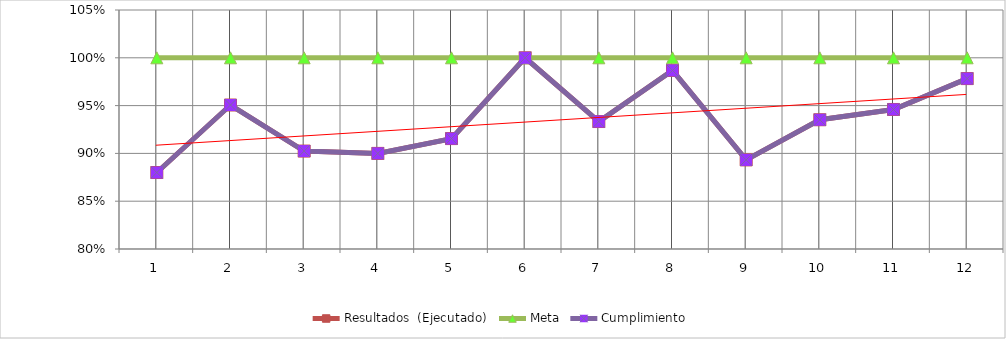
| Category | Resultados  (Ejecutado) | Meta | Cumplimiento |
|---|---|---|---|
| 0 | 0.88 | 1 | 0.88 |
| 1 | 0.951 | 1 | 0.951 |
| 2 | 0.902 | 1 | 0.902 |
| 3 | 0.9 | 1 | 0.9 |
| 4 | 0.915 | 1 | 0.915 |
| 5 | 1 | 1 | 1 |
| 6 | 0.933 | 1 | 0.933 |
| 7 | 0.987 | 1 | 0.987 |
| 8 | 0.893 | 1 | 0.893 |
| 9 | 0.935 | 1 | 0.935 |
| 10 | 0.946 | 1 | 0.946 |
| 11 | 0.978 | 1 | 0.978 |